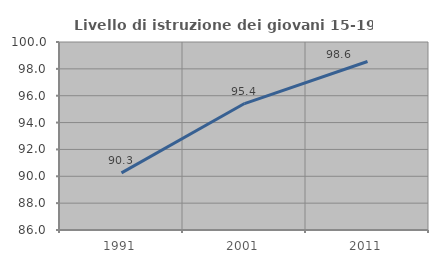
| Category | Livello di istruzione dei giovani 15-19 anni |
|---|---|
| 1991.0 | 90.253 |
| 2001.0 | 95.417 |
| 2011.0 | 98.551 |